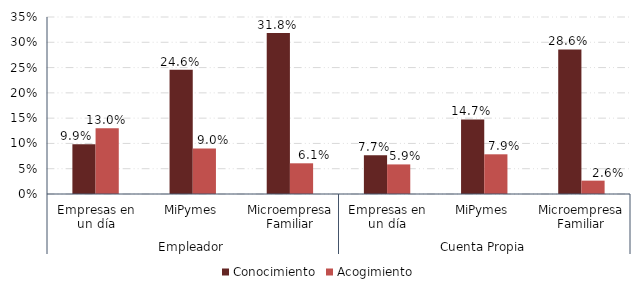
| Category | Conocimiento | Acogimiento |
|---|---|---|
| 0 | 0.098 | 0.13 |
| 1 | 0.246 | 0.09 |
| 2 | 0.318 | 0.061 |
| 3 | 0.077 | 0.058 |
| 4 | 0.147 | 0.078 |
| 5 | 0.286 | 0.026 |